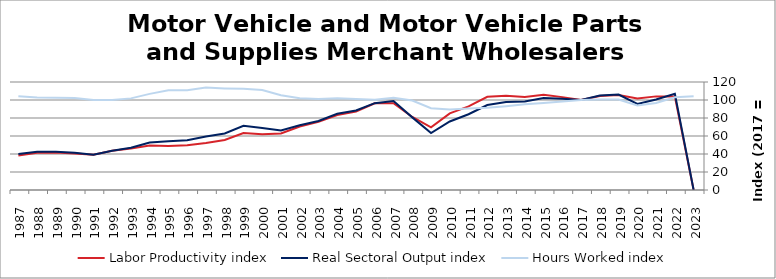
| Category | Labor Productivity index | Real Sectoral Output index | Hours Worked index |
|---|---|---|---|
| 2023.0 | 0 | 0 | 104.236 |
| 2022.0 | 103.831 | 106.974 | 103.027 |
| 2021.0 | 104.025 | 100.637 | 96.743 |
| 2020.0 | 101.749 | 95.618 | 93.975 |
| 2019.0 | 105.544 | 106.095 | 100.522 |
| 2018.0 | 104.469 | 104.969 | 100.479 |
| 2017.0 | 100 | 100 | 100 |
| 2016.0 | 103.191 | 101.425 | 98.288 |
| 2015.0 | 105.77 | 102.197 | 96.622 |
| 2014.0 | 103.376 | 98.44 | 95.226 |
| 2013.0 | 104.828 | 97.644 | 93.147 |
| 2012.0 | 103.49 | 94.444 | 91.259 |
| 2011.0 | 92.895 | 84.145 | 90.581 |
| 2010.0 | 85.141 | 76.142 | 89.43 |
| 2009.0 | 69.546 | 63.209 | 90.888 |
| 2008.0 | 81.166 | 80.685 | 99.408 |
| 2007.0 | 96.484 | 98.858 | 102.46 |
| 2006.0 | 96.301 | 96.517 | 100.224 |
| 2005.0 | 87.317 | 88.359 | 101.193 |
| 2004.0 | 83.238 | 84.77 | 101.84 |
| 2003.0 | 75.73 | 76.633 | 101.192 |
| 2002.0 | 70.61 | 72.034 | 102.017 |
| 2001.0 | 62.739 | 66.086 | 105.334 |
| 2000.0 | 62.047 | 68.934 | 111.101 |
| 1999.0 | 63.379 | 71.252 | 112.423 |
| 1998.0 | 55.652 | 62.824 | 112.887 |
| 1997.0 | 52.346 | 59.55 | 113.761 |
| 1996.0 | 49.804 | 55.184 | 110.802 |
| 1995.0 | 48.954 | 54.211 | 110.738 |
| 1994.0 | 49.41 | 52.764 | 106.789 |
| 1993.0 | 46.097 | 46.929 | 101.804 |
| 1992.0 | 43.556 | 43.526 | 99.93 |
| 1991.0 | 39.241 | 39.263 | 100.057 |
| 1990.0 | 40.57 | 41.484 | 102.253 |
| 1989.0 | 41.542 | 42.527 | 102.373 |
| 1988.0 | 41.486 | 42.601 | 102.687 |
| 1987.0 | 38.387 | 39.939 | 104.043 |